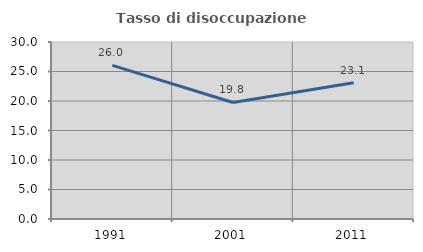
| Category | Tasso di disoccupazione giovanile  |
|---|---|
| 1991.0 | 26.038 |
| 2001.0 | 19.753 |
| 2011.0 | 23.077 |